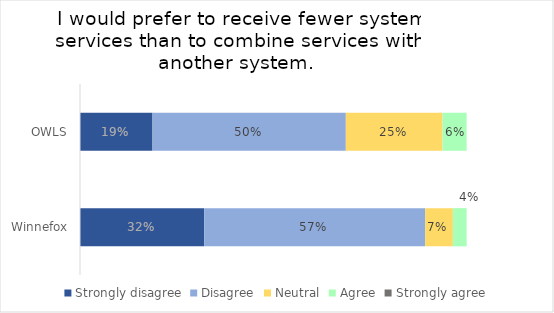
| Category | Strongly disagree | Disagree | Neutral | Agree | Strongly agree |
|---|---|---|---|---|---|
| OWLS | 0.188 | 0.5 | 0.25 | 0.062 | 0 |
| Winnefox | 0.321 | 0.571 | 0.071 | 0.036 | 0 |